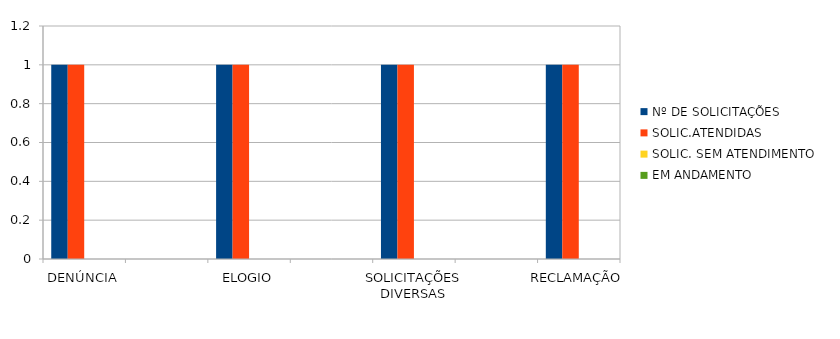
| Category | Nº DE SOLICITAÇÕES | SOLIC.ATENDIDAS | SOLIC. SEM ATENDIMENTO | EM ANDAMENTO |
|---|---|---|---|---|
| DENÚNCIA | 1 | 1 | 0 | 0 |
| DÚVIDA | 0 | 0 | 0 | 0 |
| ELOGIO | 1 | 1 | 0 | 0 |
| PEDIDO DE ACESSO À INFORMAÇÃO | 0 | 0 | 0 | 0 |
| SOLICITAÇÕES DIVERSAS | 1 | 1 | 0 | 0 |
| SUGESTÃO  | 0 | 0 | 0 | 0 |
| RECLAMAÇÃO | 1 | 1 | 0 | 0 |